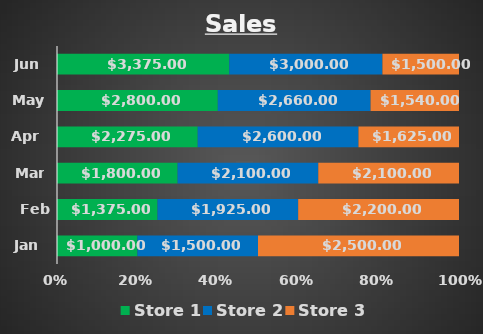
| Category | Store 1 | Store 2 | Store 3 |
|---|---|---|---|
| Jan | 1000 | 1500 | 2500 |
| Feb | 1375 | 1925 | 2200 |
| Mar | 1800 | 2100 | 2100 |
| Apr | 2275 | 2600 | 1625 |
| May | 2800 | 2660 | 1540 |
| Jun | 3375 | 3000 | 1500 |